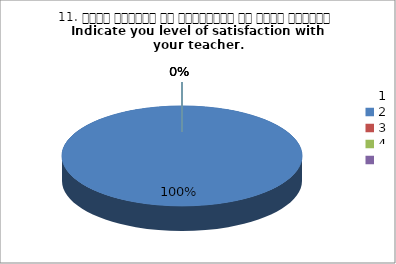
| Category | 11. अपने शिक्षक से संतुष्टि का स्तर बताइये
Indicate you level of satisfaction with your teacher.
 |
|---|---|
| 0 | 1 |
| 1 | 0 |
| 2 | 0 |
| 3 | 0 |
| 4 | 0 |